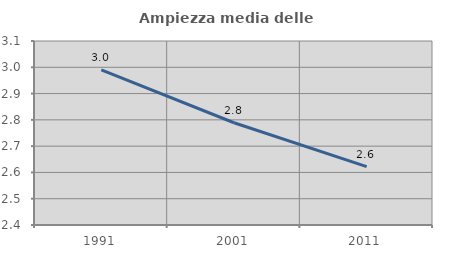
| Category | Ampiezza media delle famiglie |
|---|---|
| 1991.0 | 2.99 |
| 2001.0 | 2.789 |
| 2011.0 | 2.622 |